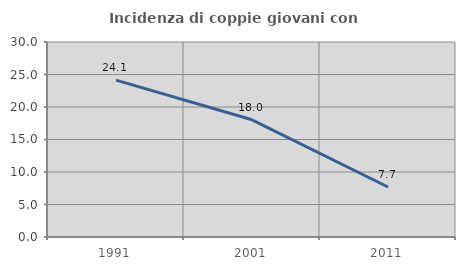
| Category | Incidenza di coppie giovani con figli |
|---|---|
| 1991.0 | 24.127 |
| 2001.0 | 18.029 |
| 2011.0 | 7.692 |